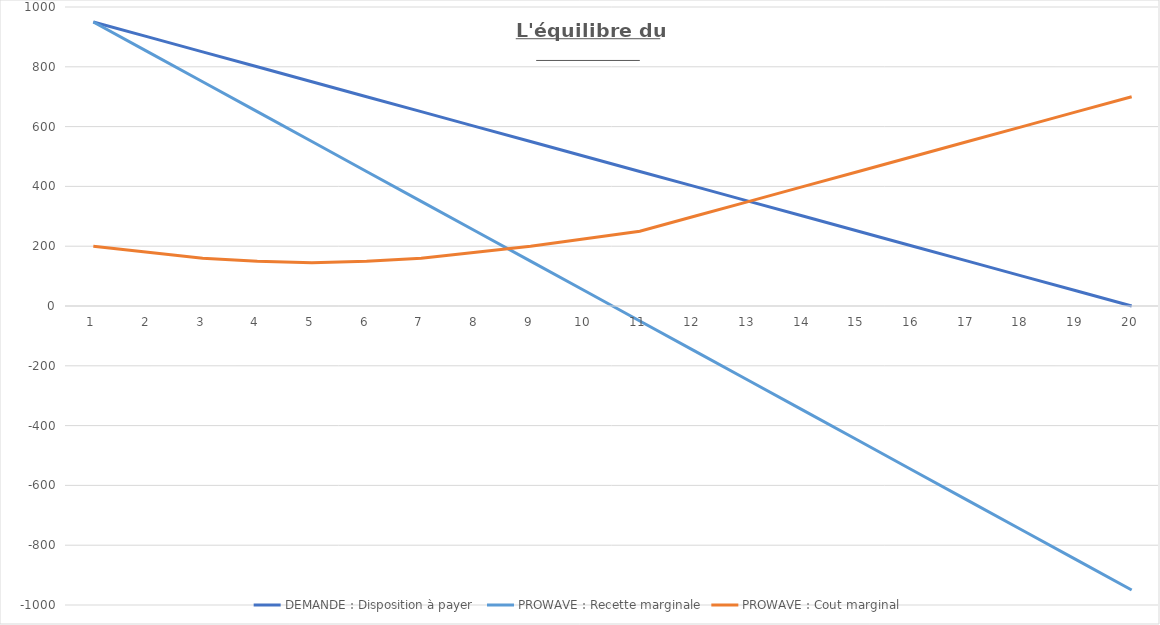
| Category | DEMANDE : | PROWAVE : |
|---|---|---|
| 1.0 | 950 | 200 |
| 2.0 | 900 | 180 |
| 3.0 | 850 | 160 |
| 4.0 | 800 | 150 |
| 5.0 | 750 | 145 |
| 6.0 | 700 | 150 |
| 7.0 | 650 | 160 |
| 8.0 | 600 | 180 |
| 9.0 | 550 | 200 |
| 10.0 | 500 | 225 |
| 11.0 | 450 | 250 |
| 12.0 | 400 | 300 |
| 13.0 | 350 | 350 |
| 14.0 | 300 | 400 |
| 15.0 | 250 | 450 |
| 16.0 | 200 | 500 |
| 17.0 | 150 | 550 |
| 18.0 | 100 | 600 |
| 19.0 | 50 | 650 |
| 20.0 | 0 | 700 |